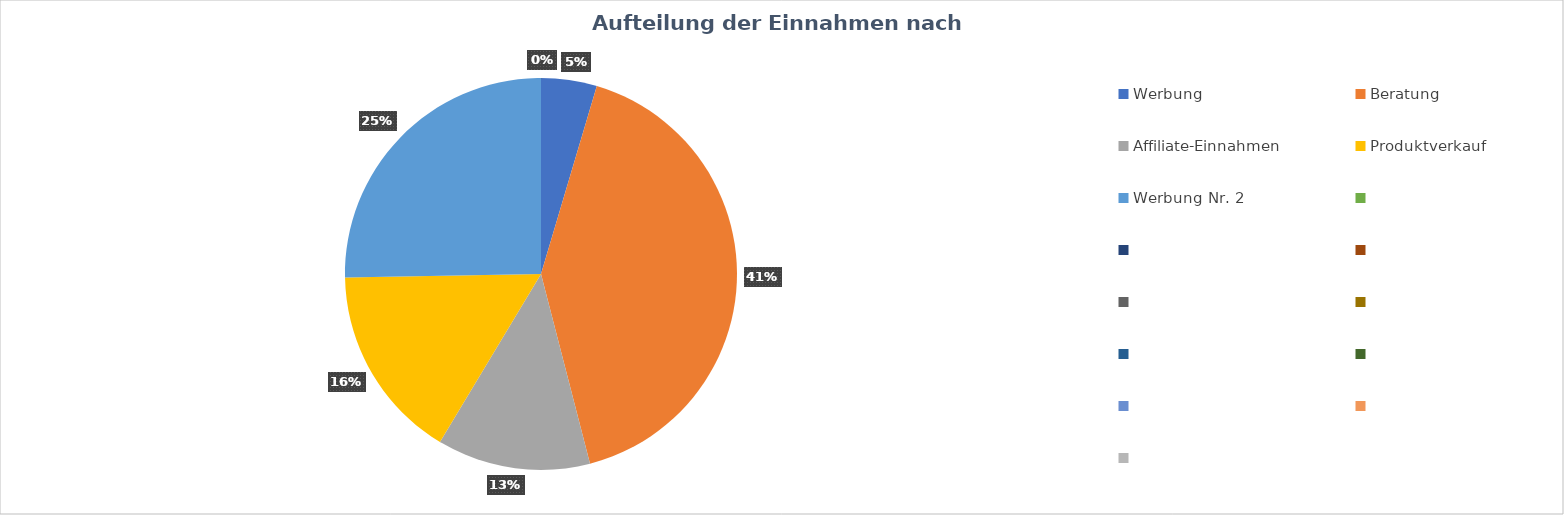
| Category | Series 0 |
|---|---|
| Werbung | 20 |
| Beratung | 180 |
| Affiliate-Einnahmen | 55 |
| Produktverkauf | 70 |
| Werbung Nr. 2 | 110 |